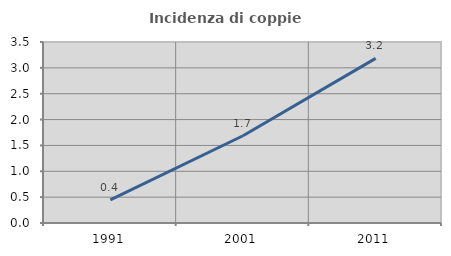
| Category | Incidenza di coppie miste |
|---|---|
| 1991.0 | 0.449 |
| 2001.0 | 1.687 |
| 2011.0 | 3.183 |